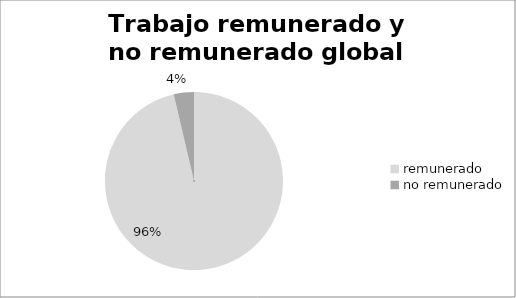
| Category | Series 0 |
|---|---|
| remunerado | 578 |
| no remunerado | 22 |